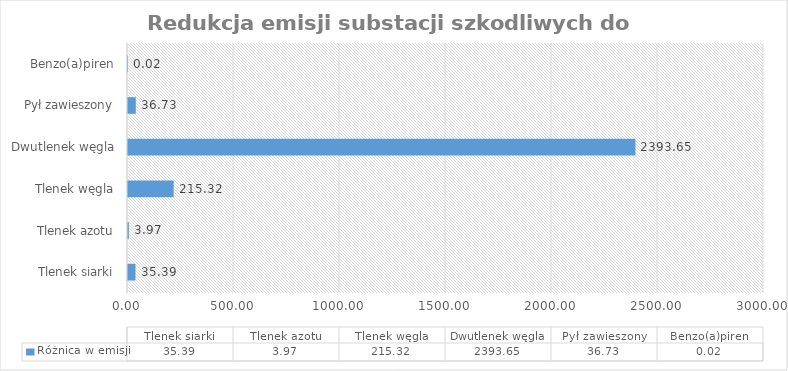
| Category | Różnica w emisji |
|---|---|
| Tlenek siarki | 35.388 |
| Tlenek azotu | 3.975 |
| Tlenek węgla | 215.321 |
| Dwutlenek węgla | 2393.645 |
| Pył zawieszony | 36.735 |
| Benzo(a)piren | 0.019 |